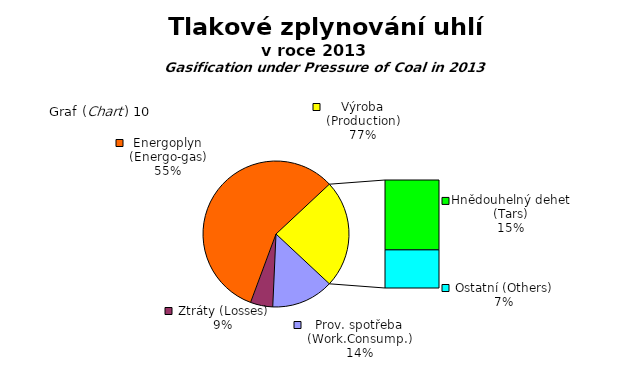
| Category | Series 0 |
|---|---|
| Prov. spotřeba (Work.Consump.) | 2991314.8 |
| Ztráty (Losses) | 1076816 |
| Energoplyn (Energo-gas) | 12476016 |
| Hnědouhelný dehet (Tars) | 3361931 |
| Ostatní (Others) | 1834502 |